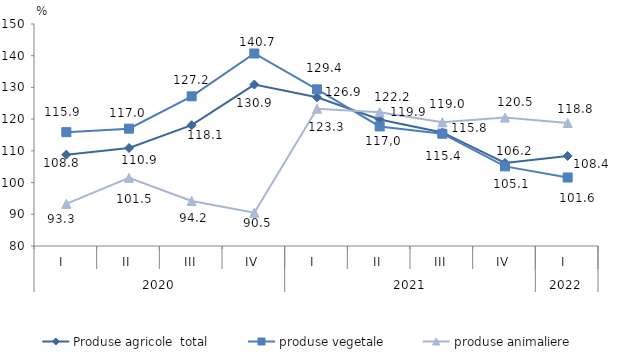
| Category | Produse agricole  total | produse vegetale | produse animaliere |
|---|---|---|---|
| 0 | 108.8 | 115.9 | 93.3 |
| 1 | 110.9 | 117 | 101.5 |
| 2 | 118.1 | 127.2 | 94.2 |
| 3 | 130.9 | 140.7 | 90.5 |
| 4 | 126.9 | 129.4 | 123.3 |
| 5 | 119.9 | 117.7 | 122.2 |
| 6 | 115.8 | 115.4 | 119 |
| 7 | 106.2 | 105.1 | 120.5 |
| 8 | 108.4 | 101.6 | 118.8 |